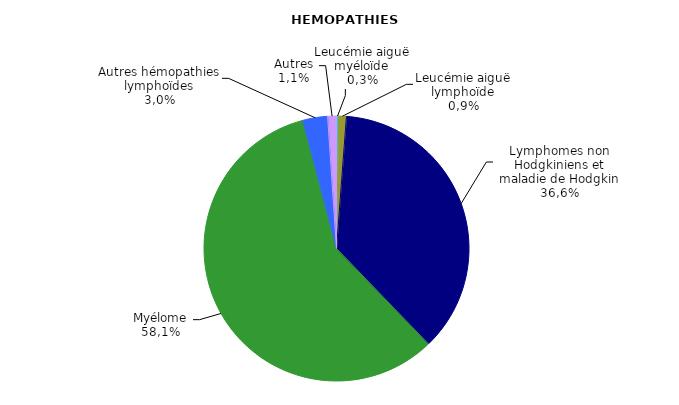
| Category | Nombre | Pourcentage |
|---|---|---|
| Leucémie aiguë myéloïde | 6 | 0.003 |
| Leucémie aiguë lymphoïde | 22 | 0.009 |
| Lymphomes non Hodgkiniens et maladie de Hodgkin | 856 | 0.366 |
| Myélome | 1359 | 0.581 |
| Autres hémopathies lymphoïdes | 71 | 0.03 |
| Autres | 25 | 0.011 |